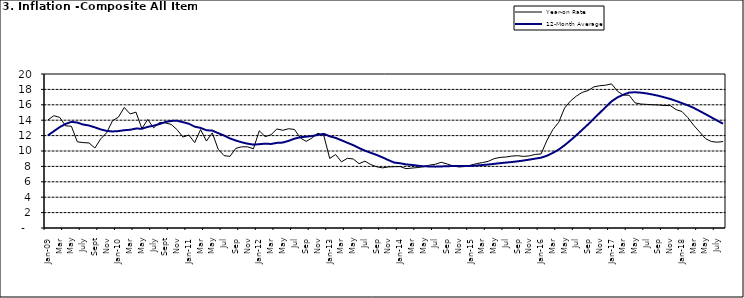
| Category | Year-on Rate | 12-Month Average |
|---|---|---|
| Jan-09 | 14.034 | 12.032 |
| Feb | 14.584 | 12.567 |
| Mar | 14.366 | 13.101 |
| Apr | 13.268 | 13.51 |
| May | 13.212 | 13.787 |
| June | 11.194 | 13.694 |
| July | 11.09 | 13.437 |
| Aug | 11.046 | 13.307 |
| Sept | 10.39 | 13.065 |
| Oct | 11.588 | 12.803 |
| Nov | 12.368 | 12.609 |
| Dec | 13.93 | 12.538 |
| Jan-10 | 14.398 | 12.586 |
| Feb | 15.649 | 12.7 |
| Mar | 14.812 | 12.757 |
| Apr | 15.044 | 12.915 |
| May | 12.915 | 12.893 |
| June | 14.099 | 13.132 |
| July | 13.002 | 13.284 |
| Aug | 13.702 | 13.5 |
| Sept | 13.65 | 13.764 |
| Oct | 13.45 | 13.908 |
| Nov | 12.766 | 13.928 |
| Dec | 11.815 | 13.74 |
| Jan-11 | 12.08 | 13.542 |
| Feb | 11.1 | 13.161 |
| Mar | 12.779 | 13.001 |
| Apr | 11.291 | 12.694 |
| May | 12.352 | 12.648 |
| Jun | 10.23 | 12.321 |
| Jul | 9.397 | 12.009 |
| Aug | 9.301 | 11.635 |
| Sep | 10.339 | 11.363 |
| Oct | 10.544 | 11.13 |
| Nov | 10.54 | 10.952 |
| Dec | 10.283 | 10.826 |
| Jan-12 | 12.626 | 10.886 |
| Feb | 11.866 | 10.955 |
| Mar | 12.111 | 10.914 |
| Apr | 12.866 | 11.054 |
| May | 12.688 | 11.096 |
| Jun | 12.892 | 11.32 |
| Jul | 12.797 | 11.599 |
| Aug | 11.689 | 11.791 |
| Sep | 11.253 | 11.859 |
| Oct | 11.693 | 11.948 |
| Nov | 12.32 | 12.091 |
| Dec | 11.981 | 12.224 |
| Jan-13 | 9.031 | 11.908 |
| Feb | 9.542 | 11.703 |
| Mar | 8.593 | 11.394 |
| Apr | 9.052 | 11.072 |
| May | 8.964 | 10.761 |
| Jun | 8.353 | 10.383 |
| Jul | 8.682 | 10.047 |
| Aug | 8.231 | 9.761 |
| Sep | 7.952 | 9.486 |
| Oct | 7.807 | 9.167 |
| Nov | 7.931 | 8.815 |
| Dec | 7.957 | 8.496 |
| Jan-14 | 7.977 | 8.408 |
| Feb | 7.707 | 8.257 |
| Mar | 7.783 | 8.19 |
| Apr | 7.851 | 8.092 |
| May | 7.965 | 8.012 |
| Jun | 8.167 | 7.998 |
| Jul | 8.281 | 7.968 |
| Aug | 8.534 | 7.996 |
| Sep | 8.317 | 8.027 |
| Oct | 8.06 | 8.047 |
| Nov | 7.927 | 8.046 |
| Dec | 7.978 | 8.047 |
| Jan-15 | 8.157 | 8.063 |
| Feb | 8.359 | 8.117 |
| Mar | 8.494 | 8.176 |
| Apr | 8.655 | 8.243 |
| May | 9.003 | 8.331 |
| Jun | 9.168 | 8.417 |
| Jul | 9.218 | 8.497 |
| Aug | 9.336 | 8.566 |
| Sep | 9.394 | 8.658 |
| Oct | 9.296 | 8.76 |
| Nov | 9.368 | 8.879 |
| Dec | 9.554 | 9.009 |
| Jan-16 | 9.617 | 9.13 |
| Feb | 11.379 | 9.386 |
| Mar | 12.775 | 9.751 |
| Apr | 13.721 | 10.182 |
| May | 15.577 | 10.746 |
| Jun | 16.48 | 11.372 |
| Jul | 17.127 | 12.045 |
| Aug | 17.609 | 12.744 |
| Sep | 17.852 | 13.454 |
| Oct | 18.33 | 14.206 |
| Nov | 18.476 | 14.958 |
| Dec | 18.547 | 15.697 |
| Jan-17 | 18.719 | 16.441 |
| Feb | 17.78 | 16.958 |
| Mar | 17.256 | 17.315 |
| Apr | 17.244 | 17.591 |
| May | 16.251 | 17.628 |
| Jun | 16.098 | 17.578 |
| Jul | 16.053 | 17.475 |
| Aug | 16.012 | 17.331 |
| Sep | 15.979 | 17.17 |
| Oct | 15.905 | 16.968 |
| Nov | 15.901 | 16.76 |
| Dec | 15.372 | 16.502 |
| Jan-18 | 15.127 | 16.215 |
| Feb | 14.33 | 15.93 |
| Mar | 13.337 | 15.599 |
| Apr | 12.482 | 15.196 |
| May | 11.608 | 14.793 |
| June | 11.231 | 14.371 |
| July | 11.142 | 13.95 |
| August | 11.227 | 13.546 |